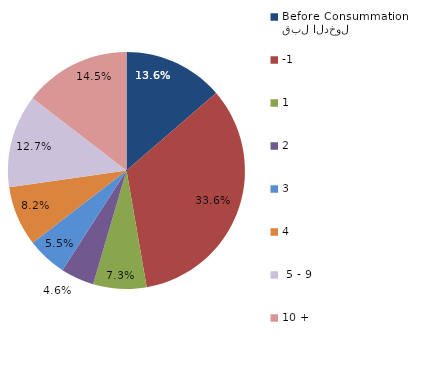
| Category | Series 0 |
|---|---|
| قبل الدخول
Before Consummation | 13.636 |
| -1 | 33.636 |
| 1 | 7.273 |
| 2 | 4.545 |
| 3 | 5.455 |
| 4 | 8.182 |
|  5 - 9 | 12.727 |
| 10 + | 14.545 |